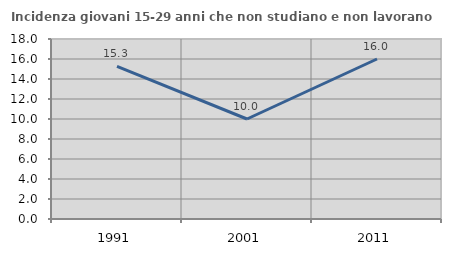
| Category | Incidenza giovani 15-29 anni che non studiano e non lavorano  |
|---|---|
| 1991.0 | 15.263 |
| 2001.0 | 10 |
| 2011.0 | 16 |